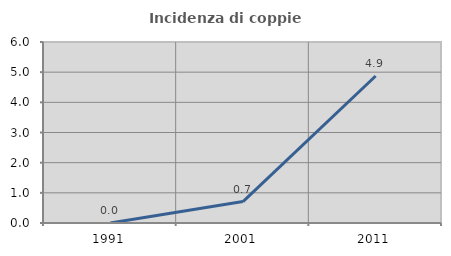
| Category | Incidenza di coppie miste |
|---|---|
| 1991.0 | 0 |
| 2001.0 | 0.709 |
| 2011.0 | 4.872 |